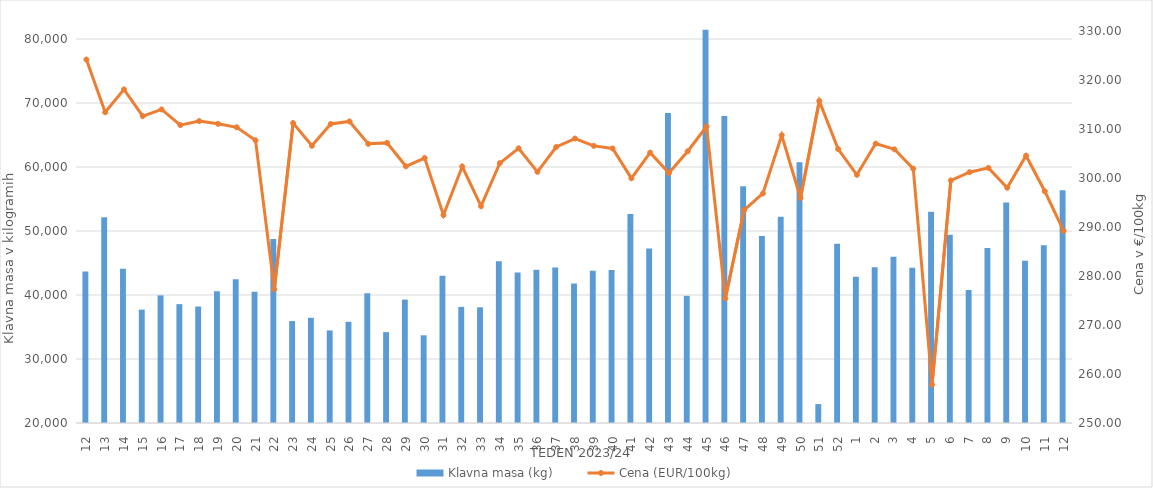
| Category | Klavna masa (kg) |
|---|---|
| 12.0 | 43683 |
| 13.0 | 52135 |
| 14.0 | 44103 |
| 15.0 | 37719 |
| 16.0 | 39943 |
| 17.0 | 38574 |
| 18.0 | 38200 |
| 19.0 | 40581 |
| 20.0 | 42443 |
| 21.0 | 40517 |
| 22.0 | 48742 |
| 23.0 | 35927 |
| 24.0 | 36436 |
| 25.0 | 34463 |
| 26.0 | 35812 |
| 27.0 | 40280 |
| 28.0 | 34201 |
| 29.0 | 39279 |
| 30.0 | 33702 |
| 31.0 | 43020 |
| 32.0 | 38146 |
| 33.0 | 38070 |
| 34.0 | 45290 |
| 35.0 | 43513 |
| 36.0 | 43945 |
| 37.0 | 44302 |
| 38.0 | 41798 |
| 39.0 | 43790 |
| 40.0 | 43913 |
| 41.0 | 52663 |
| 42.0 | 47275 |
| 43.0 | 68419 |
| 44.0 | 39872 |
| 45.0 | 81439 |
| 46.0 | 67983 |
| 47.0 | 57006 |
| 48.0 | 49204 |
| 49.0 | 52219 |
| 50.0 | 60759 |
| 51.0 | 22954 |
| 52.0 | 48002 |
| 1.0 | 42866 |
| 2.0 | 44318 |
| 3.0 | 45969 |
| 4.0 | 44266 |
| 5.0 | 52991 |
| 6.0 | 49406 |
| 7.0 | 40769 |
| 8.0 | 47349 |
| 9.0 | 54448 |
| 10.0 | 45343 |
| 11.0 | 47770 |
| 12.0 | 56370 |